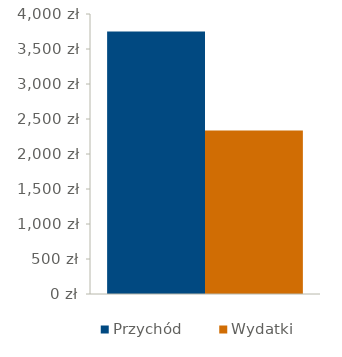
| Category | Przychód | Wydatki |
|---|---|---|
| 0 | 3750 | 2336 |